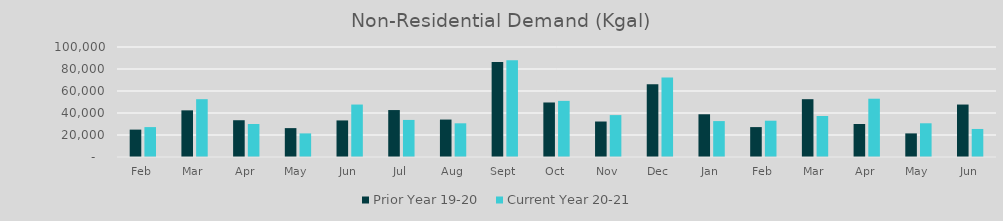
| Category | Prior Year 19-20  | Current Year 20-21 |
|---|---|---|
| Feb | 24891.705 | 27184.287 |
| Mar | 42416.796 | 52556.784 |
| Apr | 33427.881 | 30008.586 |
| May | 26254.448 | 21459.484 |
| Jun | 33248.873 | 47687.401 |
| Jul | 42679.938 | 33702.696 |
| Aug | 34036.498 | 30630.765 |
| Sep | 86367.775 | 87939.966 |
| Oct | 49561.754 | 51017.647 |
| Nov | 32261.42 | 38090.247 |
| Dec | 66164.871 | 72201.815 |
| Jan | 38851.995 | 32645.301 |
| Feb | 27184.287 | 32987.653 |
| Mar | 52556.784 | 37296.185 |
| Apr | 30008.586 | 52983.593 |
| May | 21459.484 | 30657.737 |
| Jun | 47687.401 | 25485.258 |